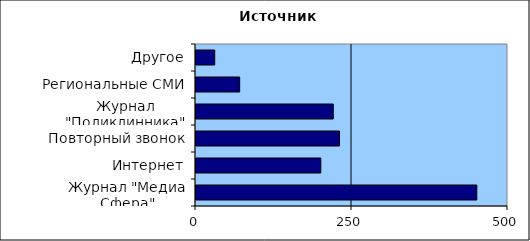
| Category | Series 0 |
|---|---|
| Журнал "Медиа Сфера" | 450 |
| Интернет | 200 |
| Повторный звонок | 230 |
| Журнал "Поликлинника" | 220 |
| Региональные СМИ | 70 |
| Другое | 30 |